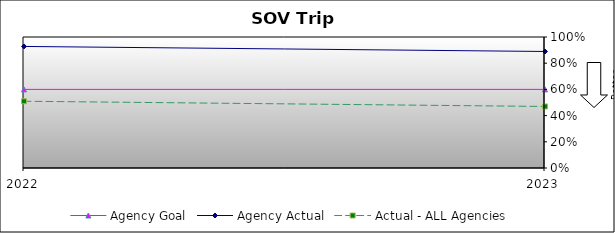
| Category | Agency Goal | Agency Actual | Actual - ALL Agencies |
|---|---|---|---|
| 2022.0 | 0.6 | 0.928 | 0.509 |
| 2023.0 | 0.6 | 0.889 | 0.47 |